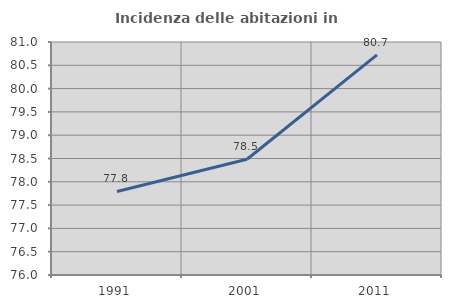
| Category | Incidenza delle abitazioni in proprietà  |
|---|---|
| 1991.0 | 77.793 |
| 2001.0 | 78.484 |
| 2011.0 | 80.723 |